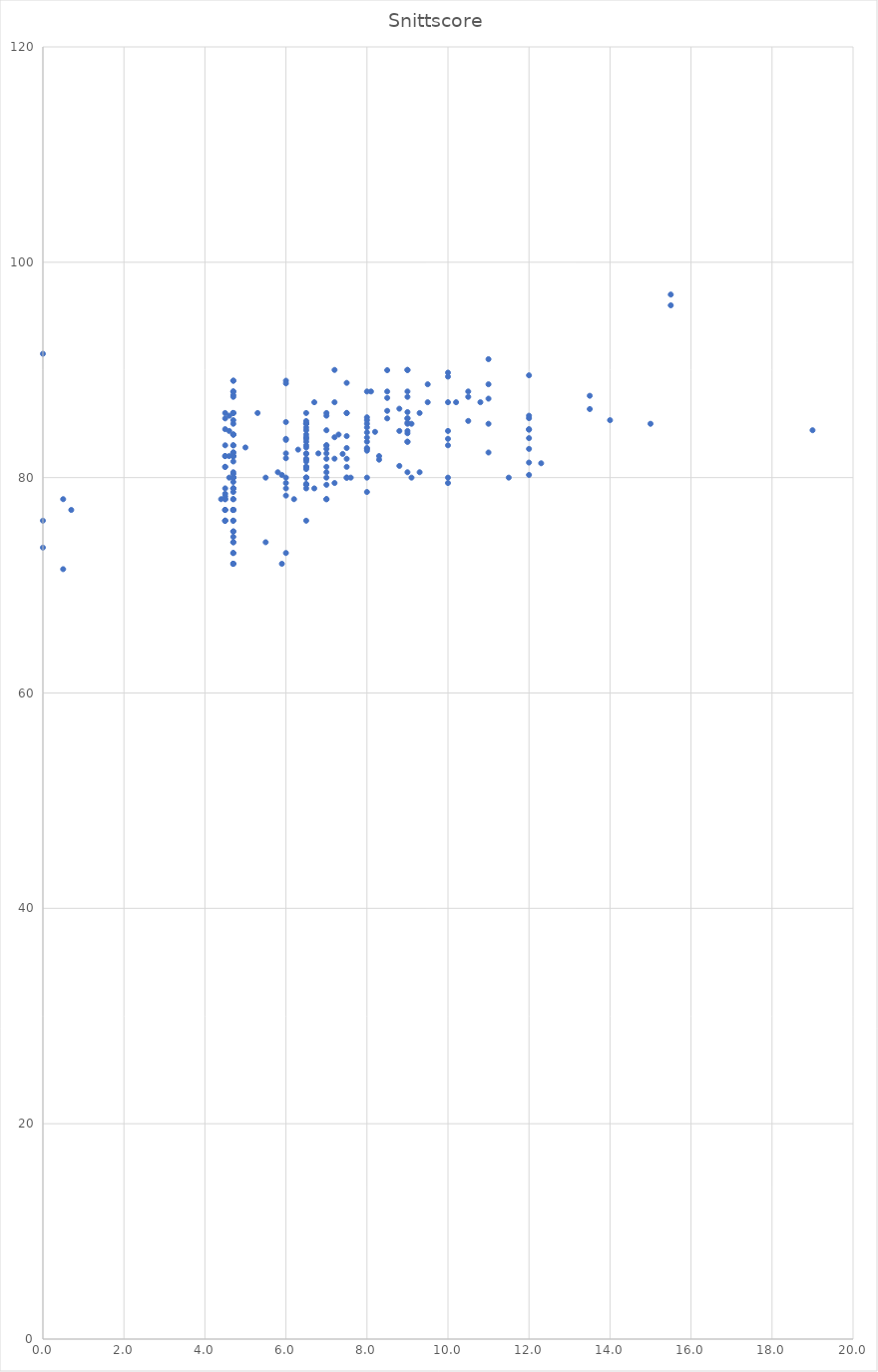
| Category | Snittscore |
|---|---|
| 15.5 | 97 |
| 15.5 | 96 |
| 0.0 | 91.5 |
| 11.0 | 91 |
| 9.0 | 90 |
| 7.2 | 90 |
| 9.0 | 90 |
| 8.5 | 89.976 |
| 10.0 | 89.75 |
| 12.0 | 89.5 |
| 10.0 | 89.38 |
| 4.7 | 89 |
| 6.0 | 89 |
| 4.7 | 89 |
| 7.5 | 88.8 |
| 6.0 | 88.75 |
| 11.0 | 88.667 |
| 9.5 | 88.667 |
| 8.0 | 88 |
| 9.0 | 88 |
| 10.5 | 88 |
| 8.5 | 88 |
| 4.7 | 88 |
| 8.1 | 88 |
| 4.7 | 88 |
| 4.7 | 87.667 |
| 13.5 | 87.6 |
| 9.0 | 87.5 |
| 10.5 | 87.5 |
| 4.7 | 87.5 |
| 8.5 | 87.4 |
| 11.0 | 87.333 |
| 10.8 | 87 |
| 7.2 | 87 |
| 10.0 | 87 |
| 10.2 | 87 |
| 6.7 | 87 |
| 9.5 | 87 |
| 8.8 | 86.4 |
| 13.5 | 86.367 |
| 8.5 | 86.2 |
| 9.0 | 86.087 |
| 4.5 | 86 |
| 7.5 | 86 |
| 4.7 | 86 |
| 9.3 | 86 |
| 6.5 | 86 |
| 7.0 | 86 |
| 5.3 | 86 |
| 7.5 | 86 |
| 4.7 | 86 |
| 4.7 | 86 |
| 12.0 | 85.75 |
| 7.0 | 85.75 |
| 4.6 | 85.75 |
| 8.0 | 85.6 |
| 12.0 | 85.52 |
| 9.0 | 85.5 |
| 4.5 | 85.5 |
| 8.5 | 85.5 |
| 9.0 | 85.5 |
| 8.0 | 85.333 |
| 14.0 | 85.333 |
| 4.7 | 85.333 |
| 10.5 | 85.264 |
| 6.5 | 85.25 |
| 6.0 | 85.16 |
| 9.0 | 85.107 |
| 15.0 | 85 |
| 9.0 | 85 |
| 11.0 | 85 |
| 8.0 | 85 |
| 6.5 | 85 |
| 4.7 | 85 |
| 6.5 | 85 |
| 9.1 | 85 |
| 6.5 | 85 |
| 8.0 | 84.667 |
| 6.5 | 84.648 |
| 12.0 | 84.5 |
| 4.5 | 84.5 |
| 12.0 | 84.45 |
| 7.0 | 84.4 |
| 6.5 | 84.4 |
| 19.0 | 84.4 |
| 4.6 | 84.333 |
| 10.0 | 84.333 |
| 8.8 | 84.333 |
| 9.0 | 84.333 |
| 8.2 | 84.25 |
| 8.0 | 84.2 |
| 9.0 | 84.12 |
| 4.7 | 84 |
| 7.3 | 84 |
| 4.7 | 84 |
| 6.5 | 84 |
| 4.7 | 84 |
| 7.5 | 83.856 |
| 6.5 | 83.75 |
| 7.2 | 83.75 |
| 8.0 | 83.72 |
| 12.0 | 83.667 |
| 10.0 | 83.6 |
| 6.0 | 83.6 |
| 6.5 | 83.6 |
| 6.0 | 83.5 |
| 6.5 | 83.333 |
| 9.0 | 83.333 |
| 9.0 | 83.333 |
| 8.0 | 83.333 |
| 4.7 | 83 |
| 7.0 | 83 |
| 7.0 | 83 |
| 10.0 | 83 |
| 4.5 | 83 |
| 6.5 | 83 |
| 4.7 | 83 |
| 6.5 | 82.8 |
| 5.0 | 82.8 |
| 7.5 | 82.75 |
| 8.0 | 82.75 |
| 12.0 | 82.667 |
| 7.0 | 82.667 |
| 8.0 | 82.667 |
| 6.3 | 82.6 |
| 8.0 | 82.5 |
| 4.7 | 82.333 |
| 4.7 | 82.333 |
| 11.0 | 82.333 |
| 6.8 | 82.25 |
| 6.5 | 82.25 |
| 6.0 | 82.25 |
| 7.0 | 82.25 |
| 7.4 | 82.2 |
| 6.5 | 82.2 |
| 4.7 | 82 |
| 4.7 | 82 |
| 4.6 | 82 |
| 4.7 | 82 |
| 4.7 | 82 |
| 8.3 | 82 |
| 4.5 | 82 |
| 4.5 | 82 |
| 6.0 | 81.8 |
| 7.2 | 81.76 |
| 6.5 | 81.75 |
| 7.0 | 81.75 |
| 7.5 | 81.75 |
| 6.5 | 81.667 |
| 8.3 | 81.667 |
| 6.5 | 81.5 |
| 4.7 | 81.5 |
| 12.0 | 81.4 |
| 12.3 | 81.333 |
| 8.8 | 81.088 |
| 6.5 | 81 |
| 6.5 | 81 |
| 7.0 | 81 |
| 4.5 | 81 |
| 7.5 | 81 |
| 4.5 | 81 |
| 6.5 | 80.8 |
| 9.0 | 80.5 |
| 4.7 | 80.5 |
| 7.0 | 80.5 |
| 9.3 | 80.5 |
| 5.8 | 80.5 |
| 4.7 | 80.333 |
| 12.0 | 80.25 |
| 5.9 | 80.25 |
| 7.6 | 80 |
| 4.7 | 80 |
| 11.5 | 80 |
| 4.7 | 80 |
| 6.0 | 80 |
| 7.0 | 80 |
| 4.6 | 80 |
| 6.5 | 80 |
| 6.5 | 80 |
| 4.7 | 80 |
| 4.7 | 80 |
| 7.5 | 80 |
| 6.5 | 80 |
| 9.1 | 80 |
| 10.0 | 80 |
| 8.0 | 80 |
| 4.7 | 80 |
| 5.5 | 80 |
| 7.5 | 80 |
| 4.7 | 79.6 |
| 7.2 | 79.5 |
| 6.0 | 79.5 |
| 10.0 | 79.5 |
| 6.5 | 79.4 |
| 6.5 | 79.4 |
| 6.5 | 79.333 |
| 7.0 | 79.333 |
| 6.7 | 79 |
| 6.5 | 79 |
| 4.5 | 79 |
| 6.0 | 79 |
| 4.7 | 79 |
| 4.7 | 79 |
| 4.7 | 79 |
| 8.0 | 78.667 |
| 4.7 | 78.667 |
| 4.5 | 78.5 |
| 6.0 | 78.333 |
| 4.5 | 78.25 |
| 7.0 | 78 |
| 4.7 | 78 |
| 4.4 | 78 |
| 6.2 | 78 |
| 4.5 | 78 |
| 7.0 | 78 |
| 4.7 | 78 |
| 4.5 | 78 |
| 0.5 | 78 |
| 4.7 | 77 |
| 4.7 | 77 |
| 4.7 | 77 |
| 4.7 | 77 |
| 4.5 | 77 |
| 4.7 | 77 |
| 4.5 | 77 |
| 0.7 | 77 |
| 4.5 | 77 |
| 4.5 | 76 |
| 4.7 | 76 |
| 4.5 | 76 |
| 4.5 | 76 |
| 0.0 | 76 |
| 4.7 | 76 |
| 6.5 | 76 |
| 4.7 | 75 |
| 4.7 | 75 |
| 4.7 | 74.5 |
| 5.5 | 74 |
| 4.7 | 74 |
| 4.7 | 74 |
| 0.0 | 73.5 |
| 4.7 | 73 |
| 4.7 | 73 |
| 6.0 | 73 |
| 4.7 | 72 |
| 5.9 | 72 |
| 4.7 | 72 |
| 4.7 | 72 |
| 0.5 | 71.5 |